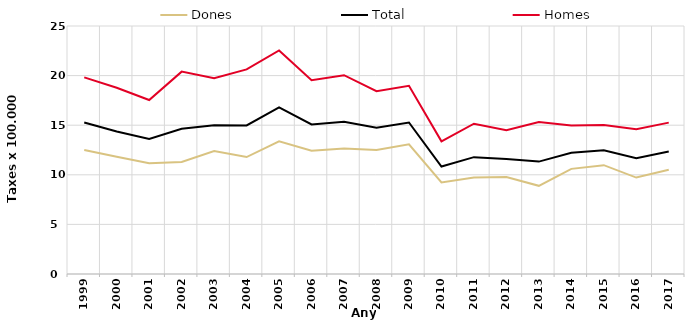
| Category | Dones | Total | Homes |
|---|---|---|---|
| 1999.0 | 12.51 | 15.27 | 19.82 |
| 2000.0 | 11.81 | 14.37 | 18.77 |
| 2001.0 | 11.17 | 13.62 | 17.54 |
| 2002.0 | 11.3 | 14.64 | 20.4 |
| 2003.0 | 12.39 | 14.99 | 19.74 |
| 2004.0 | 11.79 | 14.97 | 20.63 |
| 2005.0 | 13.37 | 16.79 | 22.54 |
| 2006.0 | 12.43 | 15.08 | 19.54 |
| 2007.0 | 12.66 | 15.35 | 20.04 |
| 2008.0 | 12.5 | 14.75 | 18.43 |
| 2009.0 | 13.08 | 15.27 | 18.97 |
| 2010.0 | 9.23 | 10.83 | 13.37 |
| 2011.0 | 9.72 | 11.78 | 15.15 |
| 2012.0 | 9.78 | 11.6 | 14.5 |
| 2013.0 | 8.89 | 11.33 | 15.31 |
| 2014.0 | 10.6 | 12.22 | 14.96 |
| 2015.0 | 10.97 | 12.47 | 15.01 |
| 2016.0 | 9.72 | 11.68 | 14.59 |
| 2017.0 | 10.51 | 12.34 | 15.26 |